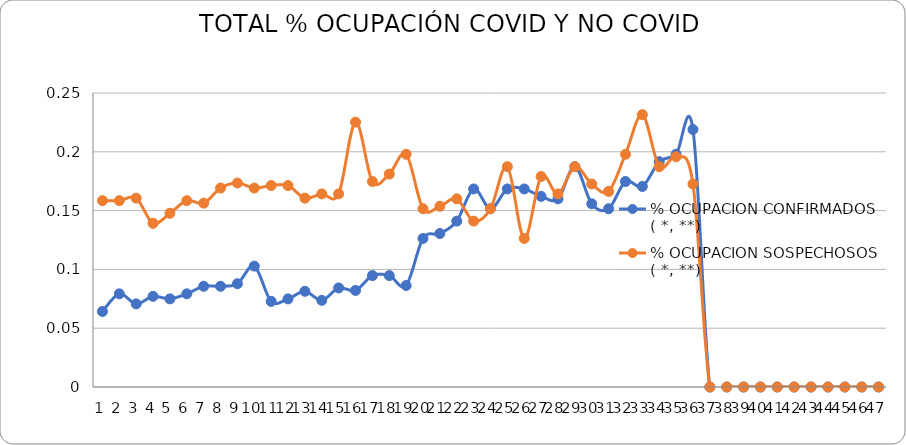
| Category | % OCUPACION CONFIRMADOS 
( *, **) | % OCUPACION SOSPECHOSOS
( *, **) |
|---|---|---|
| 0 | 0.064 | 0.158 |
| 1 | 0.079 | 0.158 |
| 2 | 0.071 | 0.161 |
| 3 | 0.077 | 0.139 |
| 4 | 0.075 | 0.148 |
| 5 | 0.079 | 0.158 |
| 6 | 0.086 | 0.156 |
| 7 | 0.086 | 0.169 |
| 8 | 0.088 | 0.173 |
| 9 | 0.103 | 0.169 |
| 10 | 0.073 | 0.171 |
| 11 | 0.075 | 0.171 |
| 12 | 0.081 | 0.161 |
| 13 | 0.074 | 0.164 |
| 14 | 0.084 | 0.164 |
| 15 | 0.082 | 0.225 |
| 16 | 0.095 | 0.175 |
| 17 | 0.095 | 0.181 |
| 18 | 0.086 | 0.198 |
| 19 | 0.126 | 0.152 |
| 20 | 0.131 | 0.154 |
| 21 | 0.141 | 0.16 |
| 22 | 0.168 | 0.141 |
| 23 | 0.152 | 0.152 |
| 24 | 0.168 | 0.187 |
| 25 | 0.168 | 0.126 |
| 26 | 0.162 | 0.179 |
| 27 | 0.16 | 0.164 |
| 28 | 0.187 | 0.187 |
| 29 | 0.156 | 0.173 |
| 30 | 0.152 | 0.166 |
| 31 | 0.175 | 0.198 |
| 32 | 0.171 | 0.232 |
| 33 | 0.192 | 0.187 |
| 34 | 0.198 | 0.196 |
| 35 | 0.219 | 0.173 |
| 36 | 0 | 0 |
| 37 | 0 | 0 |
| 38 | 0 | 0 |
| 39 | 0 | 0 |
| 40 | 0 | 0 |
| 41 | 0 | 0 |
| 42 | 0 | 0 |
| 43 | 0 | 0 |
| 44 | 0 | 0 |
| 45 | 0 | 0 |
| 46 | 0 | 0 |